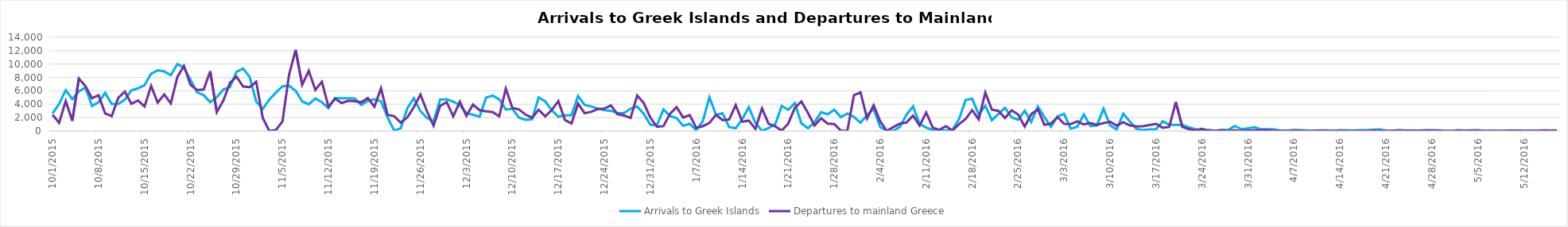
| Category | Arrivals to Greek Islands | Departures to mainland Greece |
|---|---|---|
| 10/1/15 | 2631 | 2409 |
| 10/2/15 | 4055 | 1215 |
| 10/3/15 | 6097 | 4480 |
| 10/4/15 | 4763 | 1513 |
| 10/5/15 | 5909 | 7833 |
| 10/6/15 | 6496 | 6707 |
| 10/7/15 | 3734 | 4886 |
| 10/8/15 | 4295 | 5349 |
| 10/9/15 | 5695 | 2631 |
| 10/10/15 | 4045 | 2214 |
| 10/11/15 | 4034 | 4950 |
| 10/12/15 | 4671 | 5879 |
| 10/13/15 | 6079 | 4052 |
| 10/14/15 | 6380 | 4564 |
| 10/15/15 | 6830 | 3660 |
| 10/16/15 | 8564 | 6743 |
| 10/17/15 | 9063 | 4239 |
| 10/18/15 | 8900 | 5457 |
| 10/19/15 | 8337 | 4119 |
| 10/20/15 | 10006 | 8083 |
| 10/21/15 | 9444 | 9725 |
| 10/22/15 | 7651 | 6896 |
| 10/23/15 | 5762 | 6120 |
| 10/24/15 | 5354 | 6195 |
| 10/25/15 | 4311 | 8916 |
| 10/26/15 | 5049 | 2804 |
| 10/27/15 | 6195 | 4540 |
| 10/28/15 | 6557 | 7191 |
| 10/29/15 | 8847 | 8117 |
| 10/30/15 | 9323 | 6649 |
| 10/31/15 | 8089 | 6537 |
| 11/1/15 | 4400 | 7360 |
| 11/2/15 | 3290 | 1935 |
| 11/3/15 | 4689 | 0 |
| 11/4/15 | 5740 | 142 |
| 11/5/15 | 6679 | 1430 |
| 11/6/15 | 6765 | 8392 |
| 11/7/15 | 6022 | 12116 |
| 11/8/15 | 4425 | 6902 |
| 11/9/15 | 3979 | 8977 |
| 11/10/15 | 4842 | 6133 |
| 11/11/15 | 4296 | 7354 |
| 11/12/15 | 3425 | 3650 |
| 11/13/15 | 4909 | 4820 |
| 11/14/15 | 4884 | 4171 |
| 11/15/15 | 4891 | 4497 |
| 11/16/15 | 4873 | 4442 |
| 11/17/15 | 3873 | 4289 |
| 11/18/15 | 4499 | 4927 |
| 11/19/15 | 4737 | 3644 |
| 11/20/15 | 4432 | 6389 |
| 11/21/15 | 2020 | 2401 |
| 11/22/15 | 76 | 2214 |
| 11/23/15 | 409 | 1245 |
| 11/24/15 | 3383 | 2006 |
| 11/25/15 | 4889 | 3565 |
| 11/26/15 | 2973 | 5435 |
| 11/27/15 | 1961 | 2932 |
| 11/28/15 | 1420 | 778 |
| 11/29/15 | 4703 | 3736 |
| 11/30/15 | 4744 | 4318 |
| 12/1/15 | 4386 | 2181 |
| 12/2/15 | 3863 | 4384 |
| 12/3/15 | 2671 | 2255 |
| 12/4/15 | 2435 | 3934 |
| 12/5/15 | 2110 | 3115 |
| 12/6/15 | 4978 | 2943 |
| 12/7/15 | 5287 | 2810 |
| 12/8/15 | 4721 | 2189 |
| 12/9/15 | 3203 | 6316 |
| 12/10/15 | 3308 | 3456 |
| 12/11/15 | 1999 | 3219 |
| 12/12/15 | 1671 | 2453 |
| 12/13/15 | 1738 | 1976 |
| 12/14/15 | 5005 | 3175 |
| 12/15/15 | 4421 | 2191 |
| 12/16/15 | 3105 | 3137 |
| 12/17/15 | 2135 | 4461 |
| 12/18/15 | 2330 | 1638 |
| 12/19/15 | 2373 | 1110 |
| 12/20/15 | 5223 | 4070 |
| 12/21/15 | 3904 | 2652 |
| 12/22/15 | 3668 | 2864 |
| 12/23/15 | 3354 | 3278 |
| 12/24/15 | 3110 | 3349 |
| 12/25/15 | 3008 | 3806 |
| 12/26/15 | 2710 | 2498 |
| 12/27/15 | 2678 | 2311 |
| 12/28/15 | 3337 | 1946 |
| 12/29/15 | 3643 | 5309 |
| 12/30/15 | 2552 | 4178 |
| 12/31/15 | 948 | 2009 |
| 1/1/16 | 828 | 623 |
| 1/2/16 | 3203 | 720 |
| 1/3/16 | 2241 | 2569 |
| 1/4/16 | 1917 | 3563 |
| 1/5/16 | 779 | 1998 |
| 1/6/16 | 1067 | 2377 |
| 1/7/16 | 119 | 463 |
| 1/8/16 | 1475 | 716 |
| 1/9/16 | 5050 | 1203 |
| 1/10/16 | 2410 | 2417 |
| 1/11/16 | 2645 | 1621 |
| 1/12/16 | 571 | 1701 |
| 1/13/16 | 408 | 3861 |
| 1/14/16 | 1792 | 1378 |
| 1/15/16 | 3564 | 1551 |
| 1/16/16 | 1188 | 301 |
| 1/17/16 | 39 | 3378 |
| 1/18/16 | 435 | 1078 |
| 1/19/16 | 964 | 695 |
| 1/20/16 | 3748 | 50 |
| 1/21/16 | 3166 | 1108 |
| 1/22/16 | 4176 | 3451 |
| 1/23/16 | 1124 | 4397 |
| 1/24/16 | 418 | 2706 |
| 1/25/16 | 1295 | 819 |
| 1/26/16 | 2808 | 1887 |
| 1/27/16 | 2488 | 1098 |
| 1/28/16 | 3180 | 1046 |
| 1/29/16 | 2076 | 40 |
| 1/30/16 | 2623 | 53 |
| 1/31/16 | 2105 | 5342 |
| 2/1/16 | 1244 | 5783 |
| 2/2/16 | 2368 | 1878 |
| 2/3/16 | 3299 | 3829 |
| 2/4/16 | 565 | 1436 |
| 2/5/16 | 38 | 0 |
| 2/6/16 | 7 | 578 |
| 2/7/16 | 608 | 1097 |
| 2/8/16 | 2418 | 1259 |
| 2/9/16 | 3676 | 2283 |
| 2/10/16 | 1071 | 793 |
| 2/11/16 | 502 | 2756 |
| 2/12/16 | 123 | 496 |
| 2/13/16 | 186 | 161 |
| 2/14/16 | 51 | 724 |
| 2/15/16 | 181 | 65 |
| 2/16/16 | 1783 | 1024 |
| 2/17/16 | 4611 | 1772 |
| 2/18/16 | 4824 | 3118 |
| 2/19/16 | 2440 | 1731 |
| 2/20/16 | 3772 | 5738 |
| 2/21/16 | 1618 | 3180 |
| 2/22/16 | 2545 | 3002 |
| 2/23/16 | 3474 | 1927 |
| 2/24/16 | 2044 | 3086 |
| 2/25/16 | 1675 | 2468 |
| 2/26/16 | 3021 | 649 |
| 2/27/16 | 1355 | 2525 |
| 2/28/16 | 3651 | 3234 |
| 2/29/16 | 2072 | 920 |
| 3/1/16 | 609 | 1107 |
| 3/2/16 | 2162 | 2073 |
| 3/3/16 | 2569 | 1061 |
| 3/4/16 | 332 | 1035 |
| 3/5/16 | 630 | 1444 |
| 3/6/16 | 2480 | 980 |
| 3/7/16 | 728 | 1171 |
| 3/8/16 | 811 | 922 |
| 3/9/16 | 3340 | 1169 |
| 3/10/16 | 835 | 1381 |
| 3/11/16 | 232 | 810 |
| 3/12/16 | 2578 | 1326 |
| 3/13/16 | 1418 | 831 |
| 3/14/16 | 301 | 693 |
| 3/15/16 | 128 | 721 |
| 3/16/16 | 252 | 882 |
| 3/17/16 | 263 | 1068 |
| 3/18/16 | 1431 | 489 |
| 3/19/16 | 926 | 608 |
| 3/20/16 | 931 | 4314 |
| 3/21/16 | 880 | 616 |
| 3/22/16 | 539 | 254 |
| 3/23/16 | 269 | 95 |
| 3/24/16 | 83 | 316 |
| 3/25/16 | 177 | 22 |
| 3/26/16 | 5 | 25 |
| 3/27/16 | 144 | 113 |
| 3/28/16 | 161 | 0 |
| 3/29/16 | 741 | 76 |
| 3/30/16 | 267 | 11 |
| 3/31/16 | 401 | 68 |
| 4/1/16 | 555 | 102 |
| 4/2/16 | 231 | 132 |
| 4/3/16 | 262 | 105 |
| 4/4/16 | 228 | 0 |
| 4/5/16 | 28 | 31 |
| 4/6/16 | 70 | 7 |
| 4/7/16 | 157 | 32 |
| 4/8/16 | 116 | 17 |
| 4/9/16 | 59 | 14 |
| 4/10/16 | 0 | 16 |
| 4/11/16 | 75 | 64 |
| 4/12/16 | 101 | 5 |
| 4/13/16 | 30 | 10 |
| 4/14/16 | 106 | 36 |
| 4/15/16 | 79 | 0 |
| 4/16/16 | 55 | 0 |
| 4/17/16 | 107 | 34 |
| 4/18/16 | 107 | 9 |
| 4/19/16 | 178 | 39 |
| 4/20/16 | 233 | 7 |
| 4/21/16 | 49 | 7 |
| 4/22/16 | 34 | 16 |
| 4/23/16 | 137 | 0 |
| 4/24/16 | 52 | 51 |
| 4/25/16 | 0 | 54 |
| 4/26/16 | 62 | 17 |
| 4/27/16 | 108 | 52 |
| 4/28/16 | 110 | 16 |
| 4/29/16 | 90 | 56 |
| 4/30/16 | 0 | 4 |
| 5/1/16 | 0 | 0 |
| 5/2/16 | 123 | 25 |
| 5/3/16 | 53 | 34 |
| 5/4/16 | 87 | 41 |
| 5/5/16 | 123 | 37 |
| 5/6/16 | 14 | 1 |
| 5/7/16 | 48 | 0 |
| 5/8/16 | 37 | 0 |
| 5/9/16 | 42 | 5 |
| 5/10/16 | 63 | 46 |
| 5/11/16 | 73 | 40 |
| 5/12/16 | 11 | 39 |
| 5/13/16 | 6 | 31 |
| 5/14/16 | 8 | 22 |
| 5/15/16 | 47 | 75 |
| 5/16/16 | 16 | 51 |
| 5/17/16 | 24 | 88 |